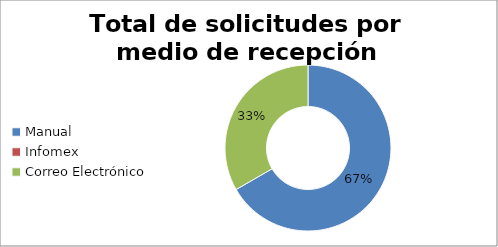
| Category | totales |
|---|---|
| Manual | 2 |
| Infomex | 0 |
| Correo Electrónico | 1 |